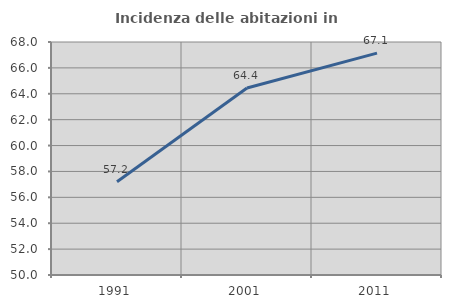
| Category | Incidenza delle abitazioni in proprietà  |
|---|---|
| 1991.0 | 57.198 |
| 2001.0 | 64.447 |
| 2011.0 | 67.141 |